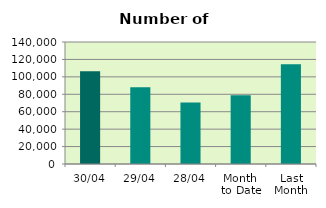
| Category | Series 0 |
|---|---|
| 30/04 | 106332 |
| 29/04 | 88196 |
| 28/04 | 70524 |
| Month 
to Date | 78959.6 |
| Last
Month | 114377.455 |